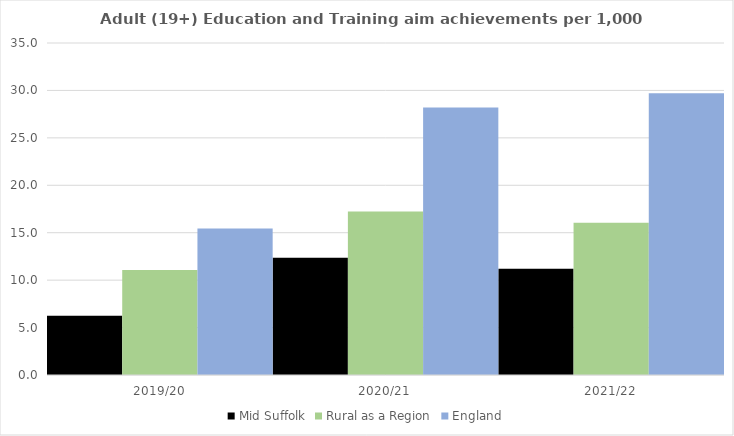
| Category | Mid Suffolk | Rural as a Region | England |
|---|---|---|---|
| 2019/20 | 6.247 | 11.081 | 15.446 |
| 2020/21 | 12.361 | 17.224 | 28.211 |
| 2021/22 | 11.194 | 16.063 | 29.711 |